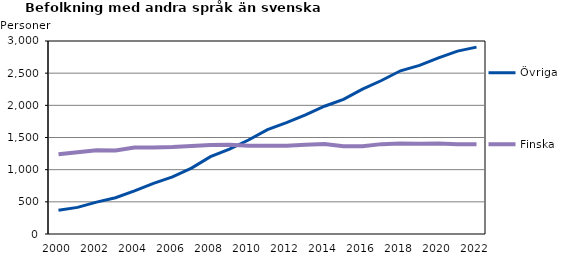
| Category | Övriga | Finska |
|---|---|---|
| 2000.0 | 369 | 1238 |
| 2001.0 | 414 | 1271 |
| 2002.0 | 495 | 1301 |
| 2003.0 | 564 | 1298 |
| 2004.0 | 669 | 1343 |
| 2005.0 | 787 | 1346 |
| 2006.0 | 888 | 1353 |
| 2007.0 | 1024 | 1369 |
| 2008.0 | 1202 | 1385 |
| 2009.0 | 1318 | 1388 |
| 2010.0 | 1461 | 1373 |
| 2011.0 | 1623 | 1371 |
| 2012.0 | 1732 | 1371 |
| 2013.0 | 1850 | 1387 |
| 2014.0 | 1986 | 1398 |
| 2015.0 | 2093 | 1363 |
| 2016.0 | 2252 | 1365 |
| 2017.0 | 2386 | 1397 |
| 2018.0 | 2537 | 1405 |
| 2019.0 | 2621 | 1403 |
| 2020.0 | 2738 | 1405 |
| 2021.0 | 2843 | 1397 |
| 2022.0 | 2905 | 1396 |